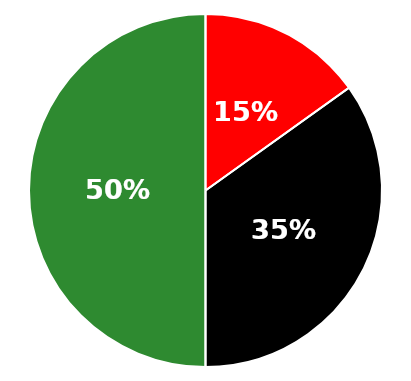
| Category | Series 0 |
|---|---|
| Total Assets | 1902500 |
| Total Debts | 575000 |
| Net Worth | 1327500 |